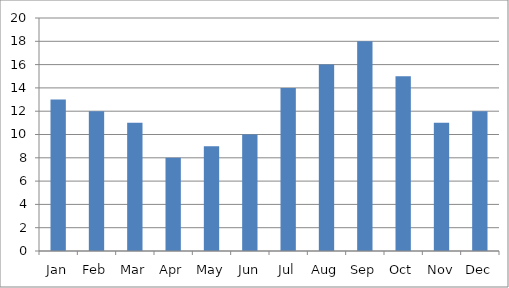
| Category | miles per hour |
|---|---|
| 0 | 13 |
| 1 | 12 |
| 2 | 11 |
| 3 | 8 |
| 4 | 9 |
| 5 | 10 |
| 6 | 14 |
| 7 | 16 |
| 8 | 18 |
| 9 | 15 |
| 10 | 11 |
| 11 | 12 |